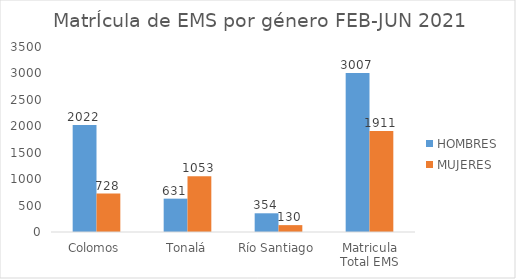
| Category | HOMBRES | MUJERES |
|---|---|---|
| Colomos | 2022 | 728 |
| Tonalá | 631 | 1053 |
| Río Santiago | 354 | 130 |
| Matricula Total EMS | 3007 | 1911 |